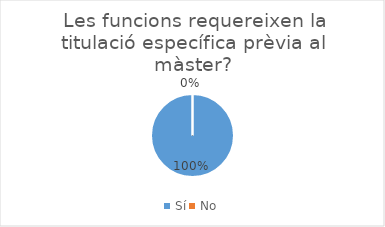
| Category | Series 0 |
|---|---|
| Sí | 17 |
| No | 0 |